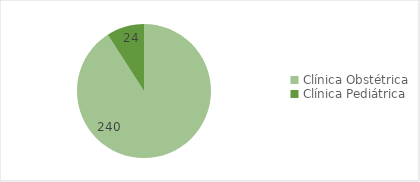
| Category | Series 0 |
|---|---|
| Clínica Obstétrica | 240 |
| Clínica Pediátrica  | 24 |